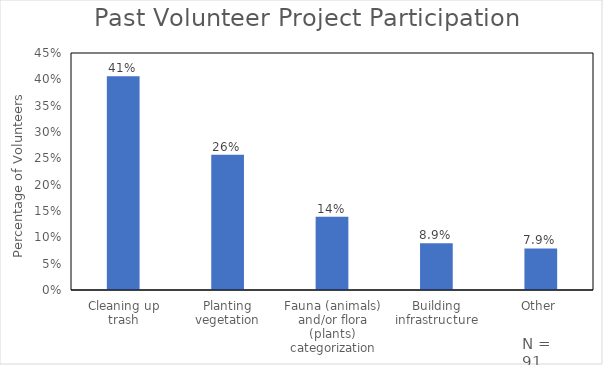
| Category | Total |
|---|---|
| Cleaning up trash | 0.406 |
| Planting vegetation | 0.257 |
| Fauna (animals) and/or flora (plants) categorization | 0.139 |
| Building infrastructure | 0.089 |
| Other | 0.079 |